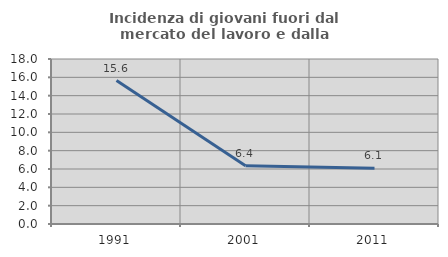
| Category | Incidenza di giovani fuori dal mercato del lavoro e dalla formazione  |
|---|---|
| 1991.0 | 15.642 |
| 2001.0 | 6.366 |
| 2011.0 | 6.085 |